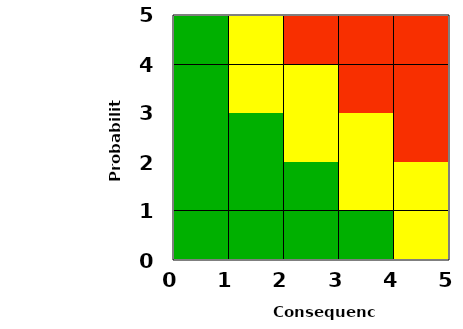
| Category | Series 0 |
|---|---|
| 2.357142857142857 | 0 |